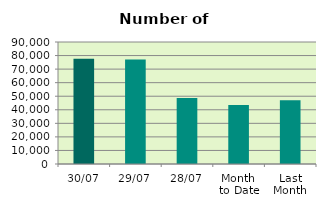
| Category | Series 0 |
|---|---|
| 30/07 | 77592 |
| 29/07 | 77014 |
| 28/07 | 48652 |
| Month 
to Date | 43458.818 |
| Last
Month | 46980.273 |